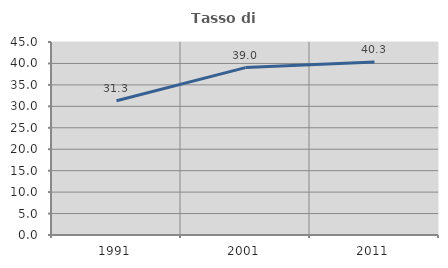
| Category | Tasso di occupazione   |
|---|---|
| 1991.0 | 31.319 |
| 2001.0 | 39.027 |
| 2011.0 | 40.319 |